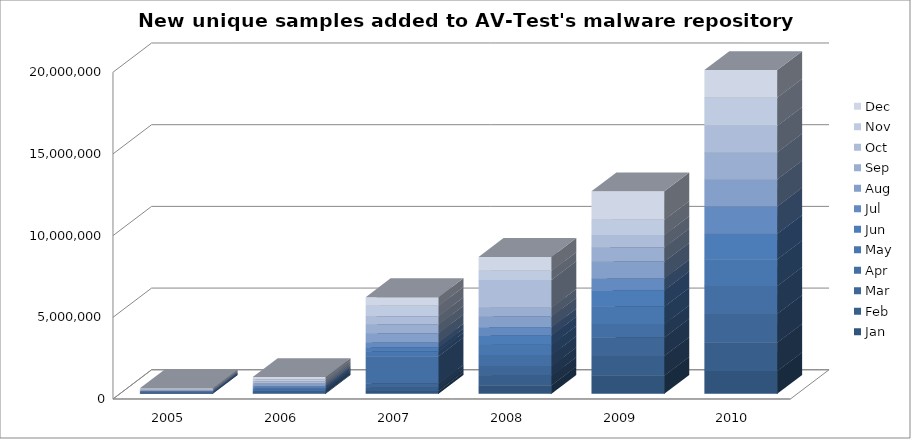
| Category | Jan | Feb | Mar | Apr | May | Jun | Jul | Aug | Sep | Oct | Nov | Dec |
|---|---|---|---|---|---|---|---|---|---|---|---|---|
| 2005.0 | 14059 | 14520 | 20491 | 20472 | 23996 | 22634 | 26303 | 30949 | 28498 | 37413 | 45873 | 48599 |
| 2006.0 | 55521 | 51452 | 50765 | 84803 | 69615 | 65887 | 91083 | 84997 | 87596 | 110072 | 131087 | 140019 |
| 2007.0 | 177615 | 194864 | 251434 | 1680631 | 290333 | 255045 | 292326 | 569838 | 527610 | 511153 | 638560 | 528090 |
| 2008.0 | 523496 | 580657 | 595260 | 677689 | 627738 | 569052 | 494452 | 656722 | 544217 | 1703594 | 554564 | 851491 |
| 2009.0 | 1118143 | 1207723 | 1128012 | 817248 | 1070530 | 1003433 | 716220 | 1033857 | 872861 | 758368 | 919858 | 1750581 |
| 2010.0 | 1394649 | 1743360 | 1761740 | 1703059 | 1627090 | 1561570 | 1678434 | 1654758 | 1661375 | 1619500 | 1723810 | 1684887 |